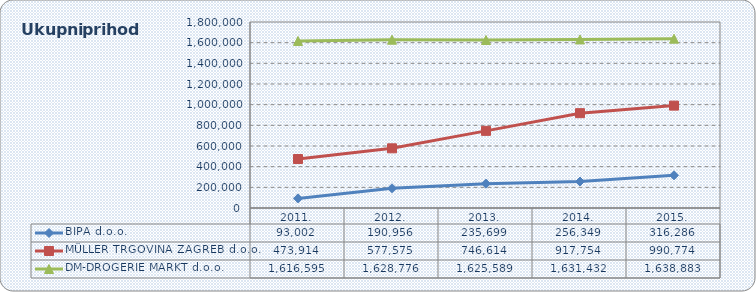
| Category | BIPA d.o.o. | MÜLLER TRGOVINA ZAGREB d.o.o. | DM-DROGERIE MARKT d.o.o. |
|---|---|---|---|
| 2011. | 93002.245 | 473913.982 | 1616595.105 |
| 2012. | 190955.93 | 577574.557 | 1628775.505 |
| 2013. | 235698.712 | 746614.079 | 1625589.088 |
| 2014. | 256348.967 | 917754.484 | 1631432.236 |
| 2015. | 316285.652 | 990774.388 | 1638883 |